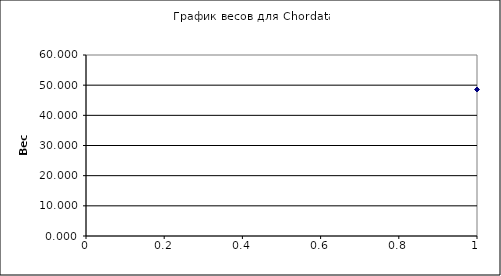
| Category | График весов для Chordata |
|---|---|
| 0 | 48.56 |
| 1 | 48.41 |
| 2 | 48.24 |
| 3 | 48.24 |
| 4 | 48.2 |
| 5 | 47.82 |
| 6 | 45.9 |
| 7 | 45.65 |
| 8 | 45.5 |
| 9 | 45.26 |
| 10 | 45.23 |
| 11 | 45.23 |
| 12 | 45.06 |
| 13 | 44.21 |
| 14 | 43.88 |
| 15 | 43.5 |
| 16 | 42.5 |
| 17 | 42.4 |
| 18 | 39.6 |
| 19 | 37.57 |
| 20 | 35.9 |
| 21 | 35.84 |
| 22 | 35.84 |
| 23 | 35.84 |
| 24 | 35.72 |
| 25 | 34.54 |
| 26 | 32.35 |
| 27 | 31.48 |
| 28 | 30.55 |
| 29 | 29.8 |
| 30 | 28.78 |
| 31 | 28.72 |
| 32 | 28.42 |
| 33 | 27.83 |
| 34 | 27.77 |
| 35 | 27.77 |
| 36 | 27.45 |
| 37 | 23.78 |
| 38 | 21.64 |
| 39 | 21.19 |
| 40 | 16.7 |
| 41 | 14.38 |